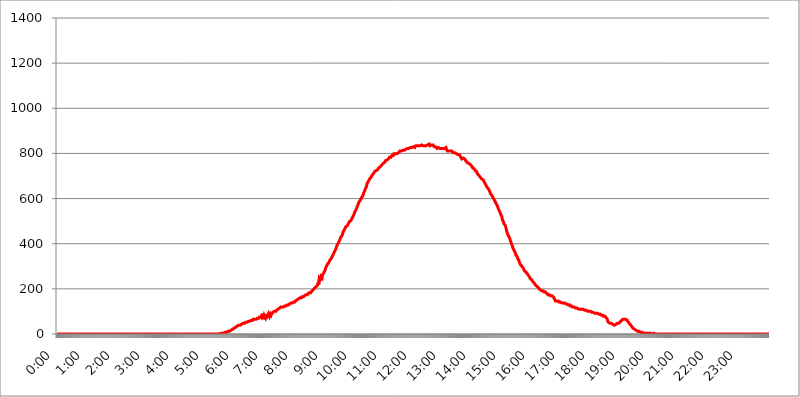
| Category | 2017.08.04. Intenzitás [W/m^2] |
|---|---|
| 0.0 | 0 |
| 0.0006944444444444445 | 0 |
| 0.001388888888888889 | 0 |
| 0.0020833333333333333 | 0 |
| 0.002777777777777778 | 0 |
| 0.003472222222222222 | 0 |
| 0.004166666666666667 | 0 |
| 0.004861111111111111 | 0 |
| 0.005555555555555556 | 0 |
| 0.0062499999999999995 | 0 |
| 0.006944444444444444 | 0 |
| 0.007638888888888889 | 0 |
| 0.008333333333333333 | 0 |
| 0.009027777777777779 | 0 |
| 0.009722222222222222 | 0 |
| 0.010416666666666666 | 0 |
| 0.011111111111111112 | 0 |
| 0.011805555555555555 | 0 |
| 0.012499999999999999 | 0 |
| 0.013194444444444444 | 0 |
| 0.013888888888888888 | 0 |
| 0.014583333333333332 | 0 |
| 0.015277777777777777 | 0 |
| 0.015972222222222224 | 0 |
| 0.016666666666666666 | 0 |
| 0.017361111111111112 | 0 |
| 0.018055555555555557 | 0 |
| 0.01875 | 0 |
| 0.019444444444444445 | 0 |
| 0.02013888888888889 | 0 |
| 0.020833333333333332 | 0 |
| 0.02152777777777778 | 0 |
| 0.022222222222222223 | 0 |
| 0.02291666666666667 | 0 |
| 0.02361111111111111 | 0 |
| 0.024305555555555556 | 0 |
| 0.024999999999999998 | 0 |
| 0.025694444444444447 | 0 |
| 0.02638888888888889 | 0 |
| 0.027083333333333334 | 0 |
| 0.027777777777777776 | 0 |
| 0.02847222222222222 | 0 |
| 0.029166666666666664 | 0 |
| 0.029861111111111113 | 0 |
| 0.030555555555555555 | 0 |
| 0.03125 | 0 |
| 0.03194444444444445 | 0 |
| 0.03263888888888889 | 0 |
| 0.03333333333333333 | 0 |
| 0.034027777777777775 | 0 |
| 0.034722222222222224 | 0 |
| 0.035416666666666666 | 0 |
| 0.036111111111111115 | 0 |
| 0.03680555555555556 | 0 |
| 0.0375 | 0 |
| 0.03819444444444444 | 0 |
| 0.03888888888888889 | 0 |
| 0.03958333333333333 | 0 |
| 0.04027777777777778 | 0 |
| 0.04097222222222222 | 0 |
| 0.041666666666666664 | 0 |
| 0.042361111111111106 | 0 |
| 0.04305555555555556 | 0 |
| 0.043750000000000004 | 0 |
| 0.044444444444444446 | 0 |
| 0.04513888888888889 | 0 |
| 0.04583333333333334 | 0 |
| 0.04652777777777778 | 0 |
| 0.04722222222222222 | 0 |
| 0.04791666666666666 | 0 |
| 0.04861111111111111 | 0 |
| 0.049305555555555554 | 0 |
| 0.049999999999999996 | 0 |
| 0.05069444444444445 | 0 |
| 0.051388888888888894 | 0 |
| 0.052083333333333336 | 0 |
| 0.05277777777777778 | 0 |
| 0.05347222222222222 | 0 |
| 0.05416666666666667 | 0 |
| 0.05486111111111111 | 0 |
| 0.05555555555555555 | 0 |
| 0.05625 | 0 |
| 0.05694444444444444 | 0 |
| 0.057638888888888885 | 0 |
| 0.05833333333333333 | 0 |
| 0.05902777777777778 | 0 |
| 0.059722222222222225 | 0 |
| 0.06041666666666667 | 0 |
| 0.061111111111111116 | 0 |
| 0.06180555555555556 | 0 |
| 0.0625 | 0 |
| 0.06319444444444444 | 0 |
| 0.06388888888888888 | 0 |
| 0.06458333333333334 | 0 |
| 0.06527777777777778 | 0 |
| 0.06597222222222222 | 0 |
| 0.06666666666666667 | 0 |
| 0.06736111111111111 | 0 |
| 0.06805555555555555 | 0 |
| 0.06874999999999999 | 0 |
| 0.06944444444444443 | 0 |
| 0.07013888888888889 | 0 |
| 0.07083333333333333 | 0 |
| 0.07152777777777779 | 0 |
| 0.07222222222222223 | 0 |
| 0.07291666666666667 | 0 |
| 0.07361111111111111 | 0 |
| 0.07430555555555556 | 0 |
| 0.075 | 0 |
| 0.07569444444444444 | 0 |
| 0.0763888888888889 | 0 |
| 0.07708333333333334 | 0 |
| 0.07777777777777778 | 0 |
| 0.07847222222222222 | 0 |
| 0.07916666666666666 | 0 |
| 0.0798611111111111 | 0 |
| 0.08055555555555556 | 0 |
| 0.08125 | 0 |
| 0.08194444444444444 | 0 |
| 0.08263888888888889 | 0 |
| 0.08333333333333333 | 0 |
| 0.08402777777777777 | 0 |
| 0.08472222222222221 | 0 |
| 0.08541666666666665 | 0 |
| 0.08611111111111112 | 0 |
| 0.08680555555555557 | 0 |
| 0.08750000000000001 | 0 |
| 0.08819444444444445 | 0 |
| 0.08888888888888889 | 0 |
| 0.08958333333333333 | 0 |
| 0.09027777777777778 | 0 |
| 0.09097222222222222 | 0 |
| 0.09166666666666667 | 0 |
| 0.09236111111111112 | 0 |
| 0.09305555555555556 | 0 |
| 0.09375 | 0 |
| 0.09444444444444444 | 0 |
| 0.09513888888888888 | 0 |
| 0.09583333333333333 | 0 |
| 0.09652777777777777 | 0 |
| 0.09722222222222222 | 0 |
| 0.09791666666666667 | 0 |
| 0.09861111111111111 | 0 |
| 0.09930555555555555 | 0 |
| 0.09999999999999999 | 0 |
| 0.10069444444444443 | 0 |
| 0.1013888888888889 | 0 |
| 0.10208333333333335 | 0 |
| 0.10277777777777779 | 0 |
| 0.10347222222222223 | 0 |
| 0.10416666666666667 | 0 |
| 0.10486111111111111 | 0 |
| 0.10555555555555556 | 0 |
| 0.10625 | 0 |
| 0.10694444444444444 | 0 |
| 0.1076388888888889 | 0 |
| 0.10833333333333334 | 0 |
| 0.10902777777777778 | 0 |
| 0.10972222222222222 | 0 |
| 0.1111111111111111 | 0 |
| 0.11180555555555556 | 0 |
| 0.11180555555555556 | 0 |
| 0.1125 | 0 |
| 0.11319444444444444 | 0 |
| 0.11388888888888889 | 0 |
| 0.11458333333333333 | 0 |
| 0.11527777777777777 | 0 |
| 0.11597222222222221 | 0 |
| 0.11666666666666665 | 0 |
| 0.1173611111111111 | 0 |
| 0.11805555555555557 | 0 |
| 0.11944444444444445 | 0 |
| 0.12013888888888889 | 0 |
| 0.12083333333333333 | 0 |
| 0.12152777777777778 | 0 |
| 0.12222222222222223 | 0 |
| 0.12291666666666667 | 0 |
| 0.12291666666666667 | 0 |
| 0.12361111111111112 | 0 |
| 0.12430555555555556 | 0 |
| 0.125 | 0 |
| 0.12569444444444444 | 0 |
| 0.12638888888888888 | 0 |
| 0.12708333333333333 | 0 |
| 0.16875 | 0 |
| 0.12847222222222224 | 0 |
| 0.12916666666666668 | 0 |
| 0.12986111111111112 | 0 |
| 0.13055555555555556 | 0 |
| 0.13125 | 0 |
| 0.13194444444444445 | 0 |
| 0.1326388888888889 | 0 |
| 0.13333333333333333 | 0 |
| 0.13402777777777777 | 0 |
| 0.13402777777777777 | 0 |
| 0.13472222222222222 | 0 |
| 0.13541666666666666 | 0 |
| 0.1361111111111111 | 0 |
| 0.13749999999999998 | 0 |
| 0.13819444444444443 | 0 |
| 0.1388888888888889 | 0 |
| 0.13958333333333334 | 0 |
| 0.14027777777777778 | 0 |
| 0.14097222222222222 | 0 |
| 0.14166666666666666 | 0 |
| 0.1423611111111111 | 0 |
| 0.14305555555555557 | 0 |
| 0.14375000000000002 | 0 |
| 0.14444444444444446 | 0 |
| 0.1451388888888889 | 0 |
| 0.1451388888888889 | 0 |
| 0.14652777777777778 | 0 |
| 0.14722222222222223 | 0 |
| 0.14791666666666667 | 0 |
| 0.1486111111111111 | 0 |
| 0.14930555555555555 | 0 |
| 0.15 | 0 |
| 0.15069444444444444 | 0 |
| 0.15138888888888888 | 0 |
| 0.15208333333333332 | 0 |
| 0.15277777777777776 | 0 |
| 0.15347222222222223 | 0 |
| 0.15416666666666667 | 0 |
| 0.15486111111111112 | 0 |
| 0.15555555555555556 | 0 |
| 0.15625 | 0 |
| 0.15694444444444444 | 0 |
| 0.15763888888888888 | 0 |
| 0.15833333333333333 | 0 |
| 0.15902777777777777 | 0 |
| 0.15972222222222224 | 0 |
| 0.16041666666666668 | 0 |
| 0.16111111111111112 | 0 |
| 0.16180555555555556 | 0 |
| 0.1625 | 0 |
| 0.16319444444444445 | 0 |
| 0.1638888888888889 | 0 |
| 0.16458333333333333 | 0 |
| 0.16527777777777777 | 0 |
| 0.16597222222222222 | 0 |
| 0.16666666666666666 | 0 |
| 0.1673611111111111 | 0 |
| 0.16805555555555554 | 0 |
| 0.16874999999999998 | 0 |
| 0.16944444444444443 | 0 |
| 0.17013888888888887 | 0 |
| 0.1708333333333333 | 0 |
| 0.17152777777777775 | 0 |
| 0.17222222222222225 | 0 |
| 0.1729166666666667 | 0 |
| 0.17361111111111113 | 0 |
| 0.17430555555555557 | 0 |
| 0.17500000000000002 | 0 |
| 0.17569444444444446 | 0 |
| 0.1763888888888889 | 0 |
| 0.17708333333333334 | 0 |
| 0.17777777777777778 | 0 |
| 0.17847222222222223 | 0 |
| 0.17916666666666667 | 0 |
| 0.1798611111111111 | 0 |
| 0.18055555555555555 | 0 |
| 0.18125 | 0 |
| 0.18194444444444444 | 0 |
| 0.1826388888888889 | 0 |
| 0.18333333333333335 | 0 |
| 0.1840277777777778 | 0 |
| 0.18472222222222223 | 0 |
| 0.18541666666666667 | 0 |
| 0.18611111111111112 | 0 |
| 0.18680555555555556 | 0 |
| 0.1875 | 0 |
| 0.18819444444444444 | 0 |
| 0.18888888888888888 | 0 |
| 0.18958333333333333 | 0 |
| 0.19027777777777777 | 0 |
| 0.1909722222222222 | 0 |
| 0.19166666666666665 | 0 |
| 0.19236111111111112 | 0 |
| 0.19305555555555554 | 0 |
| 0.19375 | 0 |
| 0.19444444444444445 | 0 |
| 0.1951388888888889 | 0 |
| 0.19583333333333333 | 0 |
| 0.19652777777777777 | 0 |
| 0.19722222222222222 | 0 |
| 0.19791666666666666 | 0 |
| 0.1986111111111111 | 0 |
| 0.19930555555555554 | 0 |
| 0.19999999999999998 | 0 |
| 0.20069444444444443 | 0 |
| 0.20138888888888887 | 0 |
| 0.2020833333333333 | 0 |
| 0.2027777777777778 | 0 |
| 0.2034722222222222 | 0 |
| 0.2041666666666667 | 0 |
| 0.20486111111111113 | 0 |
| 0.20555555555555557 | 0 |
| 0.20625000000000002 | 0 |
| 0.20694444444444446 | 0 |
| 0.2076388888888889 | 0 |
| 0.20833333333333334 | 0 |
| 0.20902777777777778 | 0 |
| 0.20972222222222223 | 0 |
| 0.21041666666666667 | 0 |
| 0.2111111111111111 | 0 |
| 0.21180555555555555 | 0 |
| 0.2125 | 0 |
| 0.21319444444444444 | 0 |
| 0.2138888888888889 | 0 |
| 0.21458333333333335 | 0 |
| 0.2152777777777778 | 0 |
| 0.21597222222222223 | 0 |
| 0.21666666666666667 | 0 |
| 0.21736111111111112 | 0 |
| 0.21805555555555556 | 0 |
| 0.21875 | 0 |
| 0.21944444444444444 | 0 |
| 0.22013888888888888 | 0 |
| 0.22083333333333333 | 0 |
| 0.22152777777777777 | 0 |
| 0.2222222222222222 | 0 |
| 0.22291666666666665 | 0 |
| 0.2236111111111111 | 0 |
| 0.22430555555555556 | 0 |
| 0.225 | 0 |
| 0.22569444444444445 | 0 |
| 0.2263888888888889 | 0 |
| 0.22708333333333333 | 0 |
| 0.22777777777777777 | 0 |
| 0.22847222222222222 | 3.525 |
| 0.22916666666666666 | 3.525 |
| 0.2298611111111111 | 3.525 |
| 0.23055555555555554 | 3.525 |
| 0.23124999999999998 | 3.525 |
| 0.23194444444444443 | 3.525 |
| 0.23263888888888887 | 3.525 |
| 0.2333333333333333 | 3.525 |
| 0.2340277777777778 | 3.525 |
| 0.2347222222222222 | 3.525 |
| 0.2354166666666667 | 7.887 |
| 0.23611111111111113 | 7.887 |
| 0.23680555555555557 | 7.887 |
| 0.23750000000000002 | 7.887 |
| 0.23819444444444446 | 7.887 |
| 0.2388888888888889 | 12.257 |
| 0.23958333333333334 | 12.257 |
| 0.24027777777777778 | 12.257 |
| 0.24097222222222223 | 12.257 |
| 0.24166666666666667 | 12.257 |
| 0.2423611111111111 | 16.636 |
| 0.24305555555555555 | 16.636 |
| 0.24375 | 16.636 |
| 0.24444444444444446 | 21.024 |
| 0.24513888888888888 | 21.024 |
| 0.24583333333333335 | 21.024 |
| 0.2465277777777778 | 25.419 |
| 0.24722222222222223 | 25.419 |
| 0.24791666666666667 | 25.419 |
| 0.24861111111111112 | 25.419 |
| 0.24930555555555556 | 29.823 |
| 0.25 | 29.823 |
| 0.25069444444444444 | 29.823 |
| 0.2513888888888889 | 29.823 |
| 0.2520833333333333 | 34.234 |
| 0.25277777777777777 | 34.234 |
| 0.2534722222222222 | 34.234 |
| 0.25416666666666665 | 38.653 |
| 0.2548611111111111 | 38.653 |
| 0.2555555555555556 | 38.653 |
| 0.25625000000000003 | 38.653 |
| 0.2569444444444445 | 38.653 |
| 0.2576388888888889 | 43.079 |
| 0.25833333333333336 | 43.079 |
| 0.2590277777777778 | 43.079 |
| 0.25972222222222224 | 43.079 |
| 0.2604166666666667 | 47.511 |
| 0.2611111111111111 | 47.511 |
| 0.26180555555555557 | 47.511 |
| 0.2625 | 47.511 |
| 0.26319444444444445 | 47.511 |
| 0.2638888888888889 | 51.951 |
| 0.26458333333333334 | 51.951 |
| 0.2652777777777778 | 51.951 |
| 0.2659722222222222 | 51.951 |
| 0.26666666666666666 | 51.951 |
| 0.2673611111111111 | 51.951 |
| 0.26805555555555555 | 56.398 |
| 0.26875 | 56.398 |
| 0.26944444444444443 | 56.398 |
| 0.2701388888888889 | 56.398 |
| 0.2708333333333333 | 56.398 |
| 0.27152777777777776 | 56.398 |
| 0.2722222222222222 | 60.85 |
| 0.27291666666666664 | 60.85 |
| 0.2736111111111111 | 60.85 |
| 0.2743055555555555 | 60.85 |
| 0.27499999999999997 | 65.31 |
| 0.27569444444444446 | 65.31 |
| 0.27638888888888885 | 65.31 |
| 0.27708333333333335 | 65.31 |
| 0.2777777777777778 | 65.31 |
| 0.27847222222222223 | 65.31 |
| 0.2791666666666667 | 65.31 |
| 0.2798611111111111 | 65.31 |
| 0.28055555555555556 | 69.775 |
| 0.28125 | 69.775 |
| 0.28194444444444444 | 69.775 |
| 0.2826388888888889 | 69.775 |
| 0.2833333333333333 | 74.246 |
| 0.28402777777777777 | 74.246 |
| 0.2847222222222222 | 74.246 |
| 0.28541666666666665 | 74.246 |
| 0.28611111111111115 | 78.722 |
| 0.28680555555555554 | 74.246 |
| 0.28750000000000003 | 78.722 |
| 0.2881944444444445 | 74.246 |
| 0.2888888888888889 | 65.31 |
| 0.28958333333333336 | 74.246 |
| 0.2902777777777778 | 83.205 |
| 0.29097222222222224 | 83.205 |
| 0.2916666666666667 | 74.246 |
| 0.2923611111111111 | 87.692 |
| 0.29305555555555557 | 74.246 |
| 0.29375 | 87.692 |
| 0.29444444444444445 | 78.722 |
| 0.2951388888888889 | 83.205 |
| 0.29583333333333334 | 83.205 |
| 0.2965277777777778 | 92.184 |
| 0.2972222222222222 | 87.692 |
| 0.29791666666666666 | 78.722 |
| 0.2986111111111111 | 78.722 |
| 0.29930555555555555 | 87.692 |
| 0.3 | 83.205 |
| 0.30069444444444443 | 87.692 |
| 0.3013888888888889 | 92.184 |
| 0.3020833333333333 | 92.184 |
| 0.30277777777777776 | 96.682 |
| 0.3034722222222222 | 96.682 |
| 0.30416666666666664 | 96.682 |
| 0.3048611111111111 | 101.184 |
| 0.3055555555555555 | 101.184 |
| 0.30624999999999997 | 101.184 |
| 0.3069444444444444 | 101.184 |
| 0.3076388888888889 | 105.69 |
| 0.30833333333333335 | 105.69 |
| 0.3090277777777778 | 105.69 |
| 0.30972222222222223 | 110.201 |
| 0.3104166666666667 | 110.201 |
| 0.3111111111111111 | 110.201 |
| 0.31180555555555556 | 114.716 |
| 0.3125 | 114.716 |
| 0.31319444444444444 | 119.235 |
| 0.3138888888888889 | 119.235 |
| 0.3145833333333333 | 119.235 |
| 0.31527777777777777 | 119.235 |
| 0.3159722222222222 | 119.235 |
| 0.31666666666666665 | 119.235 |
| 0.31736111111111115 | 119.235 |
| 0.31805555555555554 | 119.235 |
| 0.31875000000000003 | 123.758 |
| 0.3194444444444445 | 123.758 |
| 0.3201388888888889 | 123.758 |
| 0.32083333333333336 | 123.758 |
| 0.3215277777777778 | 123.758 |
| 0.32222222222222224 | 128.284 |
| 0.3229166666666667 | 128.284 |
| 0.3236111111111111 | 128.284 |
| 0.32430555555555557 | 128.284 |
| 0.325 | 128.284 |
| 0.32569444444444445 | 132.814 |
| 0.3263888888888889 | 132.814 |
| 0.32708333333333334 | 132.814 |
| 0.3277777777777778 | 137.347 |
| 0.3284722222222222 | 137.347 |
| 0.32916666666666666 | 137.347 |
| 0.3298611111111111 | 137.347 |
| 0.33055555555555555 | 137.347 |
| 0.33125 | 141.884 |
| 0.33194444444444443 | 141.884 |
| 0.3326388888888889 | 141.884 |
| 0.3333333333333333 | 141.884 |
| 0.3340277777777778 | 146.423 |
| 0.3347222222222222 | 146.423 |
| 0.3354166666666667 | 146.423 |
| 0.3361111111111111 | 150.964 |
| 0.3368055555555556 | 150.964 |
| 0.33749999999999997 | 150.964 |
| 0.33819444444444446 | 155.509 |
| 0.33888888888888885 | 155.509 |
| 0.33958333333333335 | 155.509 |
| 0.34027777777777773 | 160.056 |
| 0.34097222222222223 | 160.056 |
| 0.3416666666666666 | 160.056 |
| 0.3423611111111111 | 160.056 |
| 0.3430555555555555 | 164.605 |
| 0.34375 | 164.605 |
| 0.3444444444444445 | 164.605 |
| 0.3451388888888889 | 164.605 |
| 0.3458333333333334 | 164.605 |
| 0.34652777777777777 | 169.156 |
| 0.34722222222222227 | 169.156 |
| 0.34791666666666665 | 169.156 |
| 0.34861111111111115 | 173.709 |
| 0.34930555555555554 | 173.709 |
| 0.35000000000000003 | 173.709 |
| 0.3506944444444444 | 173.709 |
| 0.3513888888888889 | 178.264 |
| 0.3520833333333333 | 178.264 |
| 0.3527777777777778 | 178.264 |
| 0.3534722222222222 | 182.82 |
| 0.3541666666666667 | 182.82 |
| 0.3548611111111111 | 182.82 |
| 0.35555555555555557 | 182.82 |
| 0.35625 | 187.378 |
| 0.35694444444444445 | 187.378 |
| 0.3576388888888889 | 191.937 |
| 0.35833333333333334 | 191.937 |
| 0.3590277777777778 | 196.497 |
| 0.3597222222222222 | 196.497 |
| 0.36041666666666666 | 201.058 |
| 0.3611111111111111 | 201.058 |
| 0.36180555555555555 | 205.62 |
| 0.3625 | 205.62 |
| 0.36319444444444443 | 210.182 |
| 0.3638888888888889 | 210.182 |
| 0.3645833333333333 | 214.746 |
| 0.3652777777777778 | 219.309 |
| 0.3659722222222222 | 228.436 |
| 0.3666666666666667 | 219.309 |
| 0.3673611111111111 | 242.127 |
| 0.3680555555555556 | 237.564 |
| 0.36874999999999997 | 237.564 |
| 0.36944444444444446 | 251.251 |
| 0.37013888888888885 | 246.689 |
| 0.37083333333333335 | 237.564 |
| 0.37152777777777773 | 260.373 |
| 0.37222222222222223 | 260.373 |
| 0.3729166666666666 | 260.373 |
| 0.3736111111111111 | 269.49 |
| 0.3743055555555555 | 274.047 |
| 0.375 | 278.603 |
| 0.3756944444444445 | 283.156 |
| 0.3763888888888889 | 292.259 |
| 0.3770833333333334 | 296.808 |
| 0.37777777777777777 | 301.354 |
| 0.37847222222222227 | 301.354 |
| 0.37916666666666665 | 310.44 |
| 0.37986111111111115 | 310.44 |
| 0.38055555555555554 | 314.98 |
| 0.38125000000000003 | 319.517 |
| 0.3819444444444444 | 324.052 |
| 0.3826388888888889 | 328.584 |
| 0.3833333333333333 | 328.584 |
| 0.3840277777777778 | 333.113 |
| 0.3847222222222222 | 337.639 |
| 0.3854166666666667 | 342.162 |
| 0.3861111111111111 | 342.162 |
| 0.38680555555555557 | 351.198 |
| 0.3875 | 355.712 |
| 0.38819444444444445 | 360.221 |
| 0.3888888888888889 | 360.221 |
| 0.38958333333333334 | 369.23 |
| 0.3902777777777778 | 369.23 |
| 0.3909722222222222 | 378.224 |
| 0.39166666666666666 | 387.202 |
| 0.3923611111111111 | 387.202 |
| 0.39305555555555555 | 396.164 |
| 0.39375 | 400.638 |
| 0.39444444444444443 | 405.108 |
| 0.3951388888888889 | 409.574 |
| 0.3958333333333333 | 414.035 |
| 0.3965277777777778 | 418.492 |
| 0.3972222222222222 | 427.39 |
| 0.3979166666666667 | 427.39 |
| 0.3986111111111111 | 431.833 |
| 0.3993055555555556 | 436.27 |
| 0.39999999999999997 | 440.702 |
| 0.40069444444444446 | 449.551 |
| 0.40138888888888885 | 449.551 |
| 0.40208333333333335 | 458.38 |
| 0.40277777777777773 | 462.786 |
| 0.40347222222222223 | 467.187 |
| 0.4041666666666666 | 471.582 |
| 0.4048611111111111 | 475.972 |
| 0.4055555555555555 | 480.356 |
| 0.40625 | 480.356 |
| 0.4069444444444445 | 480.356 |
| 0.4076388888888889 | 484.735 |
| 0.4083333333333334 | 489.108 |
| 0.40902777777777777 | 493.475 |
| 0.40972222222222227 | 497.836 |
| 0.41041666666666665 | 497.836 |
| 0.41111111111111115 | 497.836 |
| 0.41180555555555554 | 502.192 |
| 0.41250000000000003 | 506.542 |
| 0.4131944444444444 | 510.885 |
| 0.4138888888888889 | 510.885 |
| 0.4145833333333333 | 519.555 |
| 0.4152777777777778 | 523.88 |
| 0.4159722222222222 | 528.2 |
| 0.4166666666666667 | 532.513 |
| 0.4173611111111111 | 541.121 |
| 0.41805555555555557 | 545.416 |
| 0.41875 | 549.704 |
| 0.41944444444444445 | 553.986 |
| 0.4201388888888889 | 558.261 |
| 0.42083333333333334 | 566.793 |
| 0.4215277777777778 | 571.049 |
| 0.4222222222222222 | 575.299 |
| 0.42291666666666666 | 583.779 |
| 0.4236111111111111 | 588.009 |
| 0.42430555555555555 | 588.009 |
| 0.425 | 592.233 |
| 0.42569444444444443 | 596.45 |
| 0.4263888888888889 | 600.661 |
| 0.4270833333333333 | 600.661 |
| 0.4277777777777778 | 609.062 |
| 0.4284722222222222 | 609.062 |
| 0.4291666666666667 | 617.436 |
| 0.4298611111111111 | 625.784 |
| 0.4305555555555556 | 625.784 |
| 0.43124999999999997 | 634.105 |
| 0.43194444444444446 | 642.4 |
| 0.43263888888888885 | 642.4 |
| 0.43333333333333335 | 650.667 |
| 0.43402777777777773 | 658.909 |
| 0.43472222222222223 | 667.123 |
| 0.4354166666666666 | 671.22 |
| 0.4361111111111111 | 675.311 |
| 0.4368055555555555 | 679.395 |
| 0.4375 | 679.395 |
| 0.4381944444444445 | 687.544 |
| 0.4388888888888889 | 687.544 |
| 0.4395833333333334 | 691.608 |
| 0.44027777777777777 | 695.666 |
| 0.44097222222222227 | 699.717 |
| 0.44166666666666665 | 703.762 |
| 0.44236111111111115 | 707.8 |
| 0.44305555555555554 | 707.8 |
| 0.44375000000000003 | 711.832 |
| 0.4444444444444444 | 711.832 |
| 0.4451388888888889 | 719.877 |
| 0.4458333333333333 | 719.877 |
| 0.4465277777777778 | 719.877 |
| 0.4472222222222222 | 723.889 |
| 0.4479166666666667 | 723.889 |
| 0.4486111111111111 | 723.889 |
| 0.44930555555555557 | 727.896 |
| 0.45 | 731.896 |
| 0.45069444444444445 | 735.89 |
| 0.4513888888888889 | 735.89 |
| 0.45208333333333334 | 735.89 |
| 0.4527777777777778 | 739.877 |
| 0.4534722222222222 | 743.859 |
| 0.45416666666666666 | 743.859 |
| 0.4548611111111111 | 747.834 |
| 0.45555555555555555 | 751.803 |
| 0.45625 | 751.803 |
| 0.45694444444444443 | 755.766 |
| 0.4576388888888889 | 755.766 |
| 0.4583333333333333 | 759.723 |
| 0.4590277777777778 | 759.723 |
| 0.4597222222222222 | 763.674 |
| 0.4604166666666667 | 767.62 |
| 0.4611111111111111 | 767.62 |
| 0.4618055555555556 | 771.559 |
| 0.46249999999999997 | 771.559 |
| 0.46319444444444446 | 771.559 |
| 0.46388888888888885 | 775.492 |
| 0.46458333333333335 | 775.492 |
| 0.46527777777777773 | 775.492 |
| 0.46597222222222223 | 783.342 |
| 0.4666666666666666 | 783.342 |
| 0.4673611111111111 | 779.42 |
| 0.4680555555555555 | 783.342 |
| 0.46875 | 787.258 |
| 0.4694444444444445 | 791.169 |
| 0.4701388888888889 | 791.169 |
| 0.4708333333333334 | 795.074 |
| 0.47152777777777777 | 791.169 |
| 0.47222222222222227 | 798.974 |
| 0.47291666666666665 | 798.974 |
| 0.47361111111111115 | 798.974 |
| 0.47430555555555554 | 798.974 |
| 0.47500000000000003 | 798.974 |
| 0.4756944444444444 | 798.974 |
| 0.4763888888888889 | 798.974 |
| 0.4770833333333333 | 802.868 |
| 0.4777777777777778 | 802.868 |
| 0.4784722222222222 | 802.868 |
| 0.4791666666666667 | 806.757 |
| 0.4798611111111111 | 806.757 |
| 0.48055555555555557 | 810.641 |
| 0.48125 | 806.757 |
| 0.48194444444444445 | 810.641 |
| 0.4826388888888889 | 810.641 |
| 0.48333333333333334 | 814.519 |
| 0.4840277777777778 | 814.519 |
| 0.4847222222222222 | 814.519 |
| 0.48541666666666666 | 810.641 |
| 0.4861111111111111 | 814.519 |
| 0.48680555555555555 | 814.519 |
| 0.4875 | 814.519 |
| 0.48819444444444443 | 814.519 |
| 0.4888888888888889 | 818.392 |
| 0.4895833333333333 | 822.26 |
| 0.4902777777777778 | 822.26 |
| 0.4909722222222222 | 822.26 |
| 0.4916666666666667 | 822.26 |
| 0.4923611111111111 | 822.26 |
| 0.4930555555555556 | 822.26 |
| 0.49374999999999997 | 822.26 |
| 0.49444444444444446 | 826.123 |
| 0.49513888888888885 | 826.123 |
| 0.49583333333333335 | 826.123 |
| 0.49652777777777773 | 826.123 |
| 0.49722222222222223 | 826.123 |
| 0.4979166666666666 | 826.123 |
| 0.4986111111111111 | 826.123 |
| 0.4993055555555555 | 829.981 |
| 0.5 | 829.981 |
| 0.5006944444444444 | 829.981 |
| 0.5013888888888889 | 826.123 |
| 0.5020833333333333 | 829.981 |
| 0.5027777777777778 | 833.834 |
| 0.5034722222222222 | 829.981 |
| 0.5041666666666667 | 829.981 |
| 0.5048611111111111 | 833.834 |
| 0.5055555555555555 | 829.981 |
| 0.50625 | 829.981 |
| 0.5069444444444444 | 833.834 |
| 0.5076388888888889 | 833.834 |
| 0.5083333333333333 | 833.834 |
| 0.5090277777777777 | 833.834 |
| 0.5097222222222222 | 833.834 |
| 0.5104166666666666 | 833.834 |
| 0.5111111111111112 | 837.682 |
| 0.5118055555555555 | 833.834 |
| 0.5125000000000001 | 833.834 |
| 0.5131944444444444 | 833.834 |
| 0.513888888888889 | 833.834 |
| 0.5145833333333333 | 833.834 |
| 0.5152777777777778 | 833.834 |
| 0.5159722222222222 | 833.834 |
| 0.5166666666666667 | 833.834 |
| 0.517361111111111 | 833.834 |
| 0.5180555555555556 | 833.834 |
| 0.5187499999999999 | 833.834 |
| 0.5194444444444445 | 837.682 |
| 0.5201388888888888 | 837.682 |
| 0.5208333333333334 | 837.682 |
| 0.5215277777777778 | 841.526 |
| 0.5222222222222223 | 837.682 |
| 0.5229166666666667 | 833.834 |
| 0.5236111111111111 | 837.682 |
| 0.5243055555555556 | 837.682 |
| 0.525 | 837.682 |
| 0.5256944444444445 | 837.682 |
| 0.5263888888888889 | 837.682 |
| 0.5270833333333333 | 837.682 |
| 0.5277777777777778 | 837.682 |
| 0.5284722222222222 | 829.981 |
| 0.5291666666666667 | 829.981 |
| 0.5298611111111111 | 829.981 |
| 0.5305555555555556 | 829.981 |
| 0.53125 | 829.981 |
| 0.5319444444444444 | 829.981 |
| 0.5326388888888889 | 822.26 |
| 0.5333333333333333 | 822.26 |
| 0.5340277777777778 | 826.123 |
| 0.5347222222222222 | 826.123 |
| 0.5354166666666667 | 822.26 |
| 0.5361111111111111 | 822.26 |
| 0.5368055555555555 | 822.26 |
| 0.5375 | 818.392 |
| 0.5381944444444444 | 818.392 |
| 0.5388888888888889 | 822.26 |
| 0.5395833333333333 | 822.26 |
| 0.5402777777777777 | 822.26 |
| 0.5409722222222222 | 822.26 |
| 0.5416666666666666 | 822.26 |
| 0.5423611111111112 | 822.26 |
| 0.5430555555555555 | 822.26 |
| 0.5437500000000001 | 826.123 |
| 0.5444444444444444 | 826.123 |
| 0.545138888888889 | 826.123 |
| 0.5458333333333333 | 818.392 |
| 0.5465277777777778 | 814.519 |
| 0.5472222222222222 | 810.641 |
| 0.5479166666666667 | 810.641 |
| 0.548611111111111 | 810.641 |
| 0.5493055555555556 | 810.641 |
| 0.5499999999999999 | 806.757 |
| 0.5506944444444445 | 806.757 |
| 0.5513888888888888 | 810.641 |
| 0.5520833333333334 | 806.757 |
| 0.5527777777777778 | 810.641 |
| 0.5534722222222223 | 810.641 |
| 0.5541666666666667 | 810.641 |
| 0.5548611111111111 | 806.757 |
| 0.5555555555555556 | 802.868 |
| 0.55625 | 802.868 |
| 0.5569444444444445 | 806.757 |
| 0.5576388888888889 | 802.868 |
| 0.5583333333333333 | 798.974 |
| 0.5590277777777778 | 798.974 |
| 0.5597222222222222 | 798.974 |
| 0.5604166666666667 | 795.074 |
| 0.5611111111111111 | 798.974 |
| 0.5618055555555556 | 795.074 |
| 0.5625 | 795.074 |
| 0.5631944444444444 | 795.074 |
| 0.5638888888888889 | 795.074 |
| 0.5645833333333333 | 791.169 |
| 0.5652777777777778 | 787.258 |
| 0.5659722222222222 | 783.342 |
| 0.5666666666666667 | 783.342 |
| 0.5673611111111111 | 775.492 |
| 0.5680555555555555 | 779.42 |
| 0.56875 | 779.42 |
| 0.5694444444444444 | 779.42 |
| 0.5701388888888889 | 775.492 |
| 0.5708333333333333 | 775.492 |
| 0.5715277777777777 | 775.492 |
| 0.5722222222222222 | 771.559 |
| 0.5729166666666666 | 767.62 |
| 0.5736111111111112 | 763.674 |
| 0.5743055555555555 | 763.674 |
| 0.5750000000000001 | 759.723 |
| 0.5756944444444444 | 759.723 |
| 0.576388888888889 | 755.766 |
| 0.5770833333333333 | 755.766 |
| 0.5777777777777778 | 751.803 |
| 0.5784722222222222 | 751.803 |
| 0.5791666666666667 | 751.803 |
| 0.579861111111111 | 747.834 |
| 0.5805555555555556 | 747.834 |
| 0.5812499999999999 | 743.859 |
| 0.5819444444444445 | 739.877 |
| 0.5826388888888888 | 735.89 |
| 0.5833333333333334 | 735.89 |
| 0.5840277777777778 | 731.896 |
| 0.5847222222222223 | 731.896 |
| 0.5854166666666667 | 727.896 |
| 0.5861111111111111 | 723.889 |
| 0.5868055555555556 | 723.889 |
| 0.5875 | 719.877 |
| 0.5881944444444445 | 719.877 |
| 0.5888888888888889 | 711.832 |
| 0.5895833333333333 | 711.832 |
| 0.5902777777777778 | 707.8 |
| 0.5909722222222222 | 703.762 |
| 0.5916666666666667 | 699.717 |
| 0.5923611111111111 | 699.717 |
| 0.5930555555555556 | 695.666 |
| 0.59375 | 695.666 |
| 0.5944444444444444 | 695.666 |
| 0.5951388888888889 | 687.544 |
| 0.5958333333333333 | 687.544 |
| 0.5965277777777778 | 683.473 |
| 0.5972222222222222 | 683.473 |
| 0.5979166666666667 | 679.395 |
| 0.5986111111111111 | 675.311 |
| 0.5993055555555555 | 671.22 |
| 0.6 | 667.123 |
| 0.6006944444444444 | 663.019 |
| 0.6013888888888889 | 658.909 |
| 0.6020833333333333 | 654.791 |
| 0.6027777777777777 | 650.667 |
| 0.6034722222222222 | 650.667 |
| 0.6041666666666666 | 646.537 |
| 0.6048611111111112 | 642.4 |
| 0.6055555555555555 | 638.256 |
| 0.6062500000000001 | 634.105 |
| 0.6069444444444444 | 629.948 |
| 0.607638888888889 | 621.613 |
| 0.6083333333333333 | 621.613 |
| 0.6090277777777778 | 617.436 |
| 0.6097222222222222 | 613.252 |
| 0.6104166666666667 | 613.252 |
| 0.611111111111111 | 609.062 |
| 0.6118055555555556 | 600.661 |
| 0.6124999999999999 | 596.45 |
| 0.6131944444444445 | 592.233 |
| 0.6138888888888888 | 588.009 |
| 0.6145833333333334 | 583.779 |
| 0.6152777777777778 | 579.542 |
| 0.6159722222222223 | 575.299 |
| 0.6166666666666667 | 571.049 |
| 0.6173611111111111 | 566.793 |
| 0.6180555555555556 | 562.53 |
| 0.61875 | 553.986 |
| 0.6194444444444445 | 549.704 |
| 0.6201388888888889 | 549.704 |
| 0.6208333333333333 | 541.121 |
| 0.6215277777777778 | 536.82 |
| 0.6222222222222222 | 528.2 |
| 0.6229166666666667 | 523.88 |
| 0.6236111111111111 | 519.555 |
| 0.6243055555555556 | 506.542 |
| 0.625 | 502.192 |
| 0.6256944444444444 | 497.836 |
| 0.6263888888888889 | 489.108 |
| 0.6270833333333333 | 489.108 |
| 0.6277777777777778 | 484.735 |
| 0.6284722222222222 | 480.356 |
| 0.6291666666666667 | 475.972 |
| 0.6298611111111111 | 462.786 |
| 0.6305555555555555 | 453.968 |
| 0.63125 | 445.129 |
| 0.6319444444444444 | 445.129 |
| 0.6326388888888889 | 440.702 |
| 0.6333333333333333 | 431.833 |
| 0.6340277777777777 | 431.833 |
| 0.6347222222222222 | 422.943 |
| 0.6354166666666666 | 414.035 |
| 0.6361111111111112 | 409.574 |
| 0.6368055555555555 | 400.638 |
| 0.6375000000000001 | 396.164 |
| 0.6381944444444444 | 391.685 |
| 0.638888888888889 | 382.715 |
| 0.6395833333333333 | 378.224 |
| 0.6402777777777778 | 373.729 |
| 0.6409722222222222 | 369.23 |
| 0.6416666666666667 | 364.728 |
| 0.642361111111111 | 360.221 |
| 0.6430555555555556 | 351.198 |
| 0.6437499999999999 | 351.198 |
| 0.6444444444444445 | 346.682 |
| 0.6451388888888888 | 342.162 |
| 0.6458333333333334 | 333.113 |
| 0.6465277777777778 | 333.113 |
| 0.6472222222222223 | 328.584 |
| 0.6479166666666667 | 319.517 |
| 0.6486111111111111 | 314.98 |
| 0.6493055555555556 | 314.98 |
| 0.65 | 305.898 |
| 0.6506944444444445 | 305.898 |
| 0.6513888888888889 | 301.354 |
| 0.6520833333333333 | 296.808 |
| 0.6527777777777778 | 296.808 |
| 0.6534722222222222 | 292.259 |
| 0.6541666666666667 | 287.709 |
| 0.6548611111111111 | 283.156 |
| 0.6555555555555556 | 278.603 |
| 0.65625 | 278.603 |
| 0.6569444444444444 | 278.603 |
| 0.6576388888888889 | 274.047 |
| 0.6583333333333333 | 269.49 |
| 0.6590277777777778 | 269.49 |
| 0.6597222222222222 | 264.932 |
| 0.6604166666666667 | 260.373 |
| 0.6611111111111111 | 260.373 |
| 0.6618055555555555 | 255.813 |
| 0.6625 | 251.251 |
| 0.6631944444444444 | 246.689 |
| 0.6638888888888889 | 246.689 |
| 0.6645833333333333 | 242.127 |
| 0.6652777777777777 | 242.127 |
| 0.6659722222222222 | 237.564 |
| 0.6666666666666666 | 233 |
| 0.6673611111111111 | 233 |
| 0.6680555555555556 | 228.436 |
| 0.6687500000000001 | 228.436 |
| 0.6694444444444444 | 223.873 |
| 0.6701388888888888 | 219.309 |
| 0.6708333333333334 | 219.309 |
| 0.6715277777777778 | 214.746 |
| 0.6722222222222222 | 214.746 |
| 0.6729166666666666 | 210.182 |
| 0.6736111111111112 | 210.182 |
| 0.6743055555555556 | 210.182 |
| 0.6749999999999999 | 205.62 |
| 0.6756944444444444 | 201.058 |
| 0.6763888888888889 | 201.058 |
| 0.6770833333333334 | 196.497 |
| 0.6777777777777777 | 196.497 |
| 0.6784722222222223 | 196.497 |
| 0.6791666666666667 | 191.937 |
| 0.6798611111111111 | 191.937 |
| 0.6805555555555555 | 191.937 |
| 0.68125 | 191.937 |
| 0.6819444444444445 | 187.378 |
| 0.6826388888888889 | 187.378 |
| 0.6833333333333332 | 187.378 |
| 0.6840277777777778 | 187.378 |
| 0.6847222222222222 | 187.378 |
| 0.6854166666666667 | 182.82 |
| 0.686111111111111 | 182.82 |
| 0.6868055555555556 | 182.82 |
| 0.6875 | 178.264 |
| 0.6881944444444444 | 173.709 |
| 0.688888888888889 | 173.709 |
| 0.6895833333333333 | 173.709 |
| 0.6902777777777778 | 173.709 |
| 0.6909722222222222 | 173.709 |
| 0.6916666666666668 | 169.156 |
| 0.6923611111111111 | 169.156 |
| 0.6930555555555555 | 169.156 |
| 0.69375 | 169.156 |
| 0.6944444444444445 | 169.156 |
| 0.6951388888888889 | 169.156 |
| 0.6958333333333333 | 164.605 |
| 0.6965277777777777 | 160.056 |
| 0.6972222222222223 | 155.509 |
| 0.6979166666666666 | 150.964 |
| 0.6986111111111111 | 146.423 |
| 0.6993055555555556 | 146.423 |
| 0.7000000000000001 | 146.423 |
| 0.7006944444444444 | 146.423 |
| 0.7013888888888888 | 146.423 |
| 0.7020833333333334 | 146.423 |
| 0.7027777777777778 | 146.423 |
| 0.7034722222222222 | 141.884 |
| 0.7041666666666666 | 141.884 |
| 0.7048611111111112 | 141.884 |
| 0.7055555555555556 | 141.884 |
| 0.7062499999999999 | 141.884 |
| 0.7069444444444444 | 141.884 |
| 0.7076388888888889 | 137.347 |
| 0.7083333333333334 | 137.347 |
| 0.7090277777777777 | 137.347 |
| 0.7097222222222223 | 137.347 |
| 0.7104166666666667 | 137.347 |
| 0.7111111111111111 | 137.347 |
| 0.7118055555555555 | 137.347 |
| 0.7125 | 137.347 |
| 0.7131944444444445 | 132.814 |
| 0.7138888888888889 | 132.814 |
| 0.7145833333333332 | 132.814 |
| 0.7152777777777778 | 132.814 |
| 0.7159722222222222 | 132.814 |
| 0.7166666666666667 | 128.284 |
| 0.717361111111111 | 128.284 |
| 0.7180555555555556 | 128.284 |
| 0.71875 | 128.284 |
| 0.7194444444444444 | 123.758 |
| 0.720138888888889 | 123.758 |
| 0.7208333333333333 | 123.758 |
| 0.7215277777777778 | 123.758 |
| 0.7222222222222222 | 123.758 |
| 0.7229166666666668 | 119.235 |
| 0.7236111111111111 | 119.235 |
| 0.7243055555555555 | 119.235 |
| 0.725 | 119.235 |
| 0.7256944444444445 | 119.235 |
| 0.7263888888888889 | 119.235 |
| 0.7270833333333333 | 114.716 |
| 0.7277777777777777 | 114.716 |
| 0.7284722222222223 | 114.716 |
| 0.7291666666666666 | 114.716 |
| 0.7298611111111111 | 114.716 |
| 0.7305555555555556 | 114.716 |
| 0.7312500000000001 | 110.201 |
| 0.7319444444444444 | 110.201 |
| 0.7326388888888888 | 110.201 |
| 0.7333333333333334 | 110.201 |
| 0.7340277777777778 | 110.201 |
| 0.7347222222222222 | 110.201 |
| 0.7354166666666666 | 110.201 |
| 0.7361111111111112 | 110.201 |
| 0.7368055555555556 | 110.201 |
| 0.7374999999999999 | 110.201 |
| 0.7381944444444444 | 110.201 |
| 0.7388888888888889 | 110.201 |
| 0.7395833333333334 | 105.69 |
| 0.7402777777777777 | 105.69 |
| 0.7409722222222223 | 105.69 |
| 0.7416666666666667 | 105.69 |
| 0.7423611111111111 | 105.69 |
| 0.7430555555555555 | 105.69 |
| 0.74375 | 101.184 |
| 0.7444444444444445 | 101.184 |
| 0.7451388888888889 | 101.184 |
| 0.7458333333333332 | 101.184 |
| 0.7465277777777778 | 101.184 |
| 0.7472222222222222 | 101.184 |
| 0.7479166666666667 | 101.184 |
| 0.748611111111111 | 101.184 |
| 0.7493055555555556 | 96.682 |
| 0.75 | 96.682 |
| 0.7506944444444444 | 96.682 |
| 0.751388888888889 | 96.682 |
| 0.7520833333333333 | 96.682 |
| 0.7527777777777778 | 96.682 |
| 0.7534722222222222 | 92.184 |
| 0.7541666666666668 | 92.184 |
| 0.7548611111111111 | 92.184 |
| 0.7555555555555555 | 92.184 |
| 0.75625 | 92.184 |
| 0.7569444444444445 | 92.184 |
| 0.7576388888888889 | 92.184 |
| 0.7583333333333333 | 92.184 |
| 0.7590277777777777 | 92.184 |
| 0.7597222222222223 | 87.692 |
| 0.7604166666666666 | 87.692 |
| 0.7611111111111111 | 87.692 |
| 0.7618055555555556 | 87.692 |
| 0.7625000000000001 | 87.692 |
| 0.7631944444444444 | 83.205 |
| 0.7638888888888888 | 83.205 |
| 0.7645833333333334 | 83.205 |
| 0.7652777777777778 | 83.205 |
| 0.7659722222222222 | 78.722 |
| 0.7666666666666666 | 78.722 |
| 0.7673611111111112 | 78.722 |
| 0.7680555555555556 | 78.722 |
| 0.7687499999999999 | 78.722 |
| 0.7694444444444444 | 74.246 |
| 0.7701388888888889 | 74.246 |
| 0.7708333333333334 | 74.246 |
| 0.7715277777777777 | 65.31 |
| 0.7722222222222223 | 56.398 |
| 0.7729166666666667 | 51.951 |
| 0.7736111111111111 | 51.951 |
| 0.7743055555555555 | 51.951 |
| 0.775 | 47.511 |
| 0.7756944444444445 | 47.511 |
| 0.7763888888888889 | 47.511 |
| 0.7770833333333332 | 47.511 |
| 0.7777777777777778 | 47.511 |
| 0.7784722222222222 | 47.511 |
| 0.7791666666666667 | 43.079 |
| 0.779861111111111 | 43.079 |
| 0.7805555555555556 | 38.653 |
| 0.78125 | 38.653 |
| 0.7819444444444444 | 38.653 |
| 0.782638888888889 | 38.653 |
| 0.7833333333333333 | 43.079 |
| 0.7840277777777778 | 43.079 |
| 0.7847222222222222 | 43.079 |
| 0.7854166666666668 | 47.511 |
| 0.7861111111111111 | 47.511 |
| 0.7868055555555555 | 47.511 |
| 0.7875 | 47.511 |
| 0.7881944444444445 | 47.511 |
| 0.7888888888888889 | 51.951 |
| 0.7895833333333333 | 51.951 |
| 0.7902777777777777 | 56.398 |
| 0.7909722222222223 | 56.398 |
| 0.7916666666666666 | 60.85 |
| 0.7923611111111111 | 60.85 |
| 0.7930555555555556 | 65.31 |
| 0.7937500000000001 | 65.31 |
| 0.7944444444444444 | 65.31 |
| 0.7951388888888888 | 65.31 |
| 0.7958333333333334 | 65.31 |
| 0.7965277777777778 | 65.31 |
| 0.7972222222222222 | 65.31 |
| 0.7979166666666666 | 65.31 |
| 0.7986111111111112 | 65.31 |
| 0.7993055555555556 | 60.85 |
| 0.7999999999999999 | 56.398 |
| 0.8006944444444444 | 56.398 |
| 0.8013888888888889 | 51.951 |
| 0.8020833333333334 | 47.511 |
| 0.8027777777777777 | 47.511 |
| 0.8034722222222223 | 43.079 |
| 0.8041666666666667 | 38.653 |
| 0.8048611111111111 | 38.653 |
| 0.8055555555555555 | 34.234 |
| 0.80625 | 29.823 |
| 0.8069444444444445 | 29.823 |
| 0.8076388888888889 | 25.419 |
| 0.8083333333333332 | 25.419 |
| 0.8090277777777778 | 21.024 |
| 0.8097222222222222 | 21.024 |
| 0.8104166666666667 | 21.024 |
| 0.811111111111111 | 16.636 |
| 0.8118055555555556 | 16.636 |
| 0.8125 | 16.636 |
| 0.8131944444444444 | 16.636 |
| 0.813888888888889 | 12.257 |
| 0.8145833333333333 | 12.257 |
| 0.8152777777777778 | 12.257 |
| 0.8159722222222222 | 12.257 |
| 0.8166666666666668 | 7.887 |
| 0.8173611111111111 | 7.887 |
| 0.8180555555555555 | 7.887 |
| 0.81875 | 7.887 |
| 0.8194444444444445 | 7.887 |
| 0.8201388888888889 | 7.887 |
| 0.8208333333333333 | 7.887 |
| 0.8215277777777777 | 3.525 |
| 0.8222222222222223 | 3.525 |
| 0.8229166666666666 | 3.525 |
| 0.8236111111111111 | 3.525 |
| 0.8243055555555556 | 3.525 |
| 0.8250000000000001 | 3.525 |
| 0.8256944444444444 | 3.525 |
| 0.8263888888888888 | 3.525 |
| 0.8270833333333334 | 3.525 |
| 0.8277777777777778 | 3.525 |
| 0.8284722222222222 | 3.525 |
| 0.8291666666666666 | 3.525 |
| 0.8298611111111112 | 3.525 |
| 0.8305555555555556 | 3.525 |
| 0.8312499999999999 | 3.525 |
| 0.8319444444444444 | 3.525 |
| 0.8326388888888889 | 3.525 |
| 0.8333333333333334 | 0 |
| 0.8340277777777777 | 3.525 |
| 0.8347222222222223 | 0 |
| 0.8354166666666667 | 3.525 |
| 0.8361111111111111 | 0 |
| 0.8368055555555555 | 3.525 |
| 0.8375 | 0 |
| 0.8381944444444445 | 0 |
| 0.8388888888888889 | 0 |
| 0.8395833333333332 | 0 |
| 0.8402777777777778 | 0 |
| 0.8409722222222222 | 0 |
| 0.8416666666666667 | 0 |
| 0.842361111111111 | 0 |
| 0.8430555555555556 | 0 |
| 0.84375 | 0 |
| 0.8444444444444444 | 0 |
| 0.845138888888889 | 0 |
| 0.8458333333333333 | 0 |
| 0.8465277777777778 | 0 |
| 0.8472222222222222 | 0 |
| 0.8479166666666668 | 0 |
| 0.8486111111111111 | 0 |
| 0.8493055555555555 | 0 |
| 0.85 | 0 |
| 0.8506944444444445 | 0 |
| 0.8513888888888889 | 0 |
| 0.8520833333333333 | 0 |
| 0.8527777777777777 | 0 |
| 0.8534722222222223 | 0 |
| 0.8541666666666666 | 0 |
| 0.8548611111111111 | 0 |
| 0.8555555555555556 | 0 |
| 0.8562500000000001 | 0 |
| 0.8569444444444444 | 0 |
| 0.8576388888888888 | 0 |
| 0.8583333333333334 | 0 |
| 0.8590277777777778 | 0 |
| 0.8597222222222222 | 0 |
| 0.8604166666666666 | 0 |
| 0.8611111111111112 | 0 |
| 0.8618055555555556 | 0 |
| 0.8624999999999999 | 0 |
| 0.8631944444444444 | 0 |
| 0.8638888888888889 | 0 |
| 0.8645833333333334 | 0 |
| 0.8652777777777777 | 0 |
| 0.8659722222222223 | 0 |
| 0.8666666666666667 | 0 |
| 0.8673611111111111 | 0 |
| 0.8680555555555555 | 0 |
| 0.86875 | 0 |
| 0.8694444444444445 | 0 |
| 0.8701388888888889 | 0 |
| 0.8708333333333332 | 0 |
| 0.8715277777777778 | 0 |
| 0.8722222222222222 | 0 |
| 0.8729166666666667 | 0 |
| 0.873611111111111 | 0 |
| 0.8743055555555556 | 0 |
| 0.875 | 0 |
| 0.8756944444444444 | 0 |
| 0.876388888888889 | 0 |
| 0.8770833333333333 | 0 |
| 0.8777777777777778 | 0 |
| 0.8784722222222222 | 0 |
| 0.8791666666666668 | 0 |
| 0.8798611111111111 | 0 |
| 0.8805555555555555 | 0 |
| 0.88125 | 0 |
| 0.8819444444444445 | 0 |
| 0.8826388888888889 | 0 |
| 0.8833333333333333 | 0 |
| 0.8840277777777777 | 0 |
| 0.8847222222222223 | 0 |
| 0.8854166666666666 | 0 |
| 0.8861111111111111 | 0 |
| 0.8868055555555556 | 0 |
| 0.8875000000000001 | 0 |
| 0.8881944444444444 | 0 |
| 0.8888888888888888 | 0 |
| 0.8895833333333334 | 0 |
| 0.8902777777777778 | 0 |
| 0.8909722222222222 | 0 |
| 0.8916666666666666 | 0 |
| 0.8923611111111112 | 0 |
| 0.8930555555555556 | 0 |
| 0.8937499999999999 | 0 |
| 0.8944444444444444 | 0 |
| 0.8951388888888889 | 0 |
| 0.8958333333333334 | 0 |
| 0.8965277777777777 | 0 |
| 0.8972222222222223 | 0 |
| 0.8979166666666667 | 0 |
| 0.8986111111111111 | 0 |
| 0.8993055555555555 | 0 |
| 0.9 | 0 |
| 0.9006944444444445 | 0 |
| 0.9013888888888889 | 0 |
| 0.9020833333333332 | 0 |
| 0.9027777777777778 | 0 |
| 0.9034722222222222 | 0 |
| 0.9041666666666667 | 0 |
| 0.904861111111111 | 0 |
| 0.9055555555555556 | 0 |
| 0.90625 | 0 |
| 0.9069444444444444 | 0 |
| 0.907638888888889 | 0 |
| 0.9083333333333333 | 0 |
| 0.9090277777777778 | 0 |
| 0.9097222222222222 | 0 |
| 0.9104166666666668 | 0 |
| 0.9111111111111111 | 0 |
| 0.9118055555555555 | 0 |
| 0.9125 | 0 |
| 0.9131944444444445 | 0 |
| 0.9138888888888889 | 0 |
| 0.9145833333333333 | 0 |
| 0.9152777777777777 | 0 |
| 0.9159722222222223 | 0 |
| 0.9166666666666666 | 0 |
| 0.9173611111111111 | 0 |
| 0.9180555555555556 | 0 |
| 0.9187500000000001 | 0 |
| 0.9194444444444444 | 0 |
| 0.9201388888888888 | 0 |
| 0.9208333333333334 | 0 |
| 0.9215277777777778 | 0 |
| 0.9222222222222222 | 0 |
| 0.9229166666666666 | 0 |
| 0.9236111111111112 | 0 |
| 0.9243055555555556 | 0 |
| 0.9249999999999999 | 0 |
| 0.9256944444444444 | 0 |
| 0.9263888888888889 | 0 |
| 0.9270833333333334 | 0 |
| 0.9277777777777777 | 0 |
| 0.9284722222222223 | 0 |
| 0.9291666666666667 | 0 |
| 0.9298611111111111 | 0 |
| 0.9305555555555555 | 0 |
| 0.93125 | 0 |
| 0.9319444444444445 | 0 |
| 0.9326388888888889 | 0 |
| 0.9333333333333332 | 0 |
| 0.9340277777777778 | 0 |
| 0.9347222222222222 | 0 |
| 0.9354166666666667 | 0 |
| 0.936111111111111 | 0 |
| 0.9368055555555556 | 0 |
| 0.9375 | 0 |
| 0.9381944444444444 | 0 |
| 0.938888888888889 | 0 |
| 0.9395833333333333 | 0 |
| 0.9402777777777778 | 0 |
| 0.9409722222222222 | 0 |
| 0.9416666666666668 | 0 |
| 0.9423611111111111 | 0 |
| 0.9430555555555555 | 0 |
| 0.94375 | 0 |
| 0.9444444444444445 | 0 |
| 0.9451388888888889 | 0 |
| 0.9458333333333333 | 0 |
| 0.9465277777777777 | 0 |
| 0.9472222222222223 | 0 |
| 0.9479166666666666 | 0 |
| 0.9486111111111111 | 0 |
| 0.9493055555555556 | 0 |
| 0.9500000000000001 | 0 |
| 0.9506944444444444 | 0 |
| 0.9513888888888888 | 0 |
| 0.9520833333333334 | 0 |
| 0.9527777777777778 | 0 |
| 0.9534722222222222 | 0 |
| 0.9541666666666666 | 0 |
| 0.9548611111111112 | 0 |
| 0.9555555555555556 | 0 |
| 0.9562499999999999 | 0 |
| 0.9569444444444444 | 0 |
| 0.9576388888888889 | 0 |
| 0.9583333333333334 | 0 |
| 0.9590277777777777 | 0 |
| 0.9597222222222223 | 0 |
| 0.9604166666666667 | 0 |
| 0.9611111111111111 | 0 |
| 0.9618055555555555 | 0 |
| 0.9625 | 0 |
| 0.9631944444444445 | 0 |
| 0.9638888888888889 | 0 |
| 0.9645833333333332 | 0 |
| 0.9652777777777778 | 0 |
| 0.9659722222222222 | 0 |
| 0.9666666666666667 | 0 |
| 0.967361111111111 | 0 |
| 0.9680555555555556 | 0 |
| 0.96875 | 0 |
| 0.9694444444444444 | 0 |
| 0.970138888888889 | 0 |
| 0.9708333333333333 | 0 |
| 0.9715277777777778 | 0 |
| 0.9722222222222222 | 0 |
| 0.9729166666666668 | 0 |
| 0.9736111111111111 | 0 |
| 0.9743055555555555 | 0 |
| 0.975 | 0 |
| 0.9756944444444445 | 0 |
| 0.9763888888888889 | 0 |
| 0.9770833333333333 | 0 |
| 0.9777777777777777 | 0 |
| 0.9784722222222223 | 0 |
| 0.9791666666666666 | 0 |
| 0.9798611111111111 | 0 |
| 0.9805555555555556 | 0 |
| 0.9812500000000001 | 0 |
| 0.9819444444444444 | 0 |
| 0.9826388888888888 | 0 |
| 0.9833333333333334 | 0 |
| 0.9840277777777778 | 0 |
| 0.9847222222222222 | 0 |
| 0.9854166666666666 | 0 |
| 0.9861111111111112 | 0 |
| 0.9868055555555556 | 0 |
| 0.9874999999999999 | 0 |
| 0.9881944444444444 | 0 |
| 0.9888888888888889 | 0 |
| 0.9895833333333334 | 0 |
| 0.9902777777777777 | 0 |
| 0.9909722222222223 | 0 |
| 0.9916666666666667 | 0 |
| 0.9923611111111111 | 0 |
| 0.9930555555555555 | 0 |
| 0.99375 | 0 |
| 0.9944444444444445 | 0 |
| 0.9951388888888889 | 0 |
| 0.9958333333333332 | 0 |
| 0.9965277777777778 | 0 |
| 0.9972222222222222 | 0 |
| 0.9979166666666667 | 0 |
| 0.998611111111111 | 0 |
| 0.9993055555555556 | 0 |